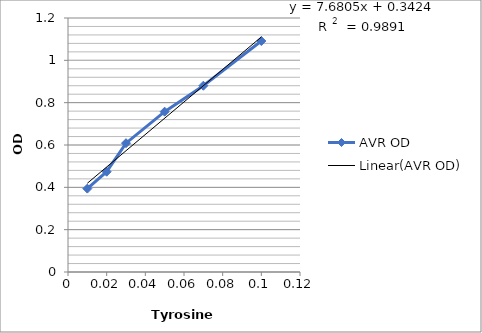
| Category | AVR OD |
|---|---|
| 0.01 | 0.394 |
| 0.02 | 0.474 |
| 0.03 | 0.609 |
| 0.05 | 0.757 |
| 0.07 | 0.88 |
| 0.1 | 1.091 |